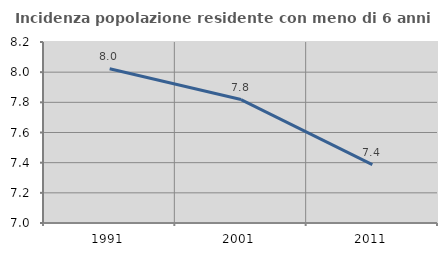
| Category | Incidenza popolazione residente con meno di 6 anni |
|---|---|
| 1991.0 | 8.022 |
| 2001.0 | 7.818 |
| 2011.0 | 7.388 |